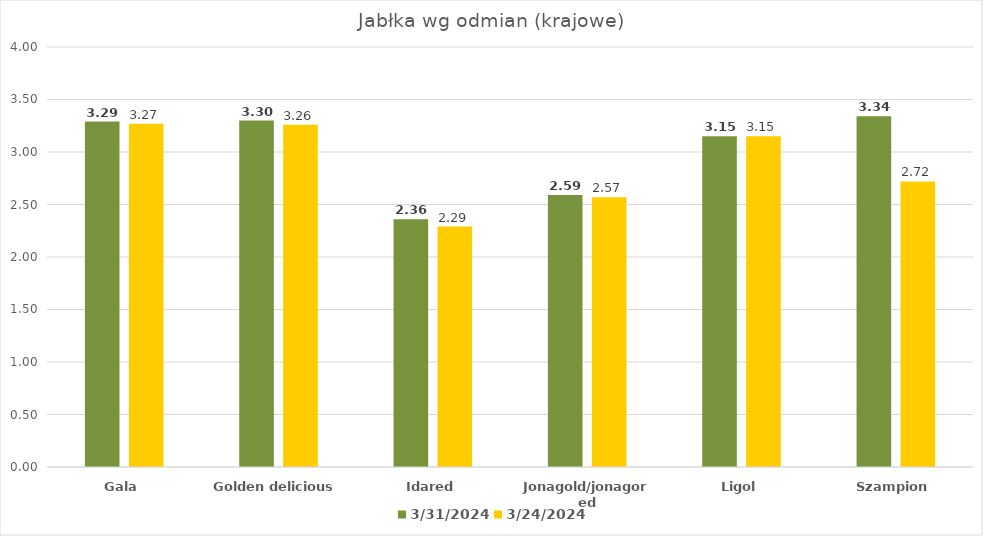
| Category | 31.03.2024 | 24.03.2024 |
|---|---|---|
| Gala | 3.29 | 3.27 |
| Golden delicious | 3.3 | 3.26 |
| Idared | 2.36 | 2.29 |
| Jonagold/jonagored | 2.59 | 2.57 |
| Ligol | 3.15 | 3.15 |
| Szampion | 3.34 | 2.72 |